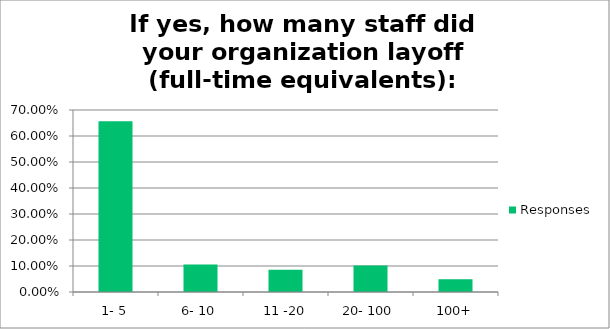
| Category | Responses |
|---|---|
| 1- 5 | 0.657 |
| 6- 10 | 0.106 |
| 11 -20 | 0.086 |
| 20- 100 | 0.102 |
| 100+ | 0.049 |